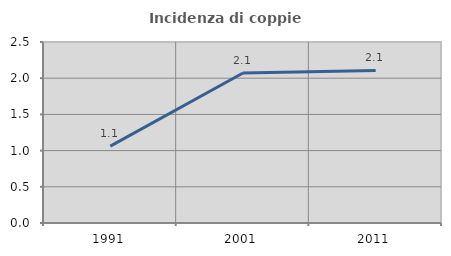
| Category | Incidenza di coppie miste |
|---|---|
| 1991.0 | 1.062 |
| 2001.0 | 2.073 |
| 2011.0 | 2.107 |